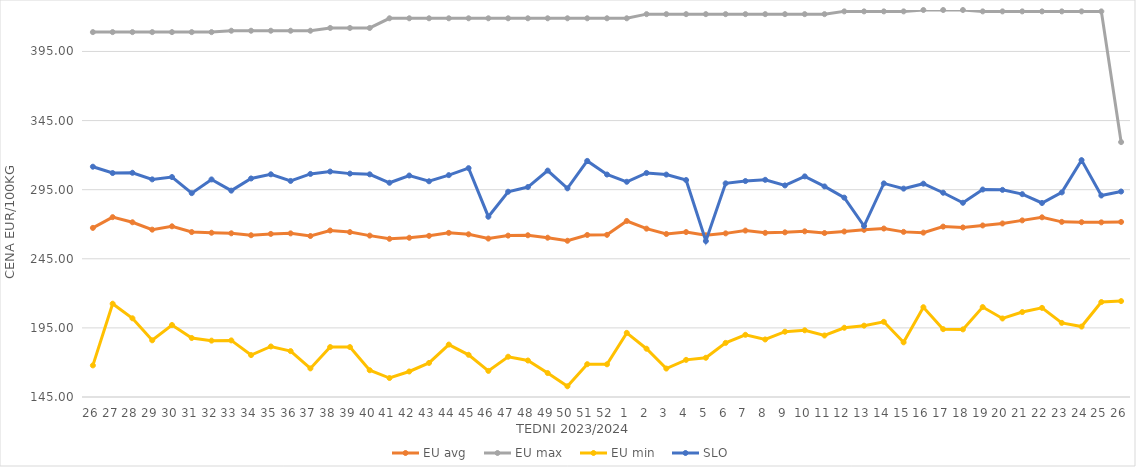
| Category | EU avg | EU max | EU min | SLO |
|---|---|---|---|---|
| 26.0 | 267.345 | 409 | 167.858 | 311.62 |
| 27.0 | 275.123 | 409 | 212.506 | 307.04 |
| 28.0 | 271.42 | 409 | 201.945 | 307.23 |
| 29.0 | 266.08 | 409 | 186.018 | 302.45 |
| 30.0 | 268.49 | 409 | 197.093 | 304.14 |
| 31.0 | 264.334 | 409 | 187.684 | 292.49 |
| 32.0 | 263.844 | 409 | 185.774 | 302.41 |
| 33.0 | 263.441 | 410 | 185.951 | 294.3 |
| 34.0 | 262.028 | 410 | 175.332 | 303.1 |
| 35.0 | 262.997 | 410 | 181.543 | 306.13 |
| 36.0 | 263.389 | 410 | 178.207 | 301.32 |
| 37.0 | 261.486 | 410 | 165.697 | 306.4 |
| 38.0 | 265.47 | 412 | 181.159 | 308.12 |
| 39.0 | 264.316 | 412 | 181.124 | 306.62 |
| 40.0 | 261.774 | 412 | 164.37 | 306.1 |
| 41.0 | 259.456 | 419 | 158.728 | 300 |
| 42.0 | 260.21 | 419 | 163.464 | 305.24 |
| 43.0 | 261.605 | 419 | 169.66 | 301.07 |
| 44.0 | 263.758 | 419 | 182.925 | 305.52 |
| 45.0 | 262.714 | 419 | 175.524 | 310.58 |
| 46.0 | 259.625 | 419 | 163.882 | 275.46 |
| 47.0 | 261.772 | 419 | 174.136 | 293.51 |
| 48.0 | 262.018 | 419 | 171.4 | 296.9 |
| 49.0 | 260.246 | 419 | 162.336 | 308.8 |
| 50.0 | 258.042 | 419 | 152.762 | 295.97 |
| 51.0 | 262.231 | 419 | 168.739 | 315.82 |
| 52.0 | 262.325 | 419 | 168.659 | 305.97 |
| 1.0 | 272.352 | 419 | 191.406 | 300.71 |
| 2.0 | 266.798 | 422 | 179.926 | 307.09 |
| 3.0 | 262.938 | 422 | 165.575 | 305.92 |
| 4.0 | 264.34 | 422 | 171.865 | 301.97 |
| 5.0 | 262.015 | 422 | 173.378 | 257.83 |
| 6.0 | 263.39 | 422 | 184.141 | 299.57 |
| 7.0 | 265.419 | 422 | 190.004 | 301.25 |
| 8.0 | 263.762 | 422 | 186.634 | 302.13 |
| 9.0 | 264.137 | 422 | 192.243 | 298.07 |
| 10.0 | 264.859 | 422 | 193.276 | 304.62 |
| 11.0 | 263.652 | 422 | 189.495 | 297.35 |
| 12.0 | 264.728 | 424 | 195.103 | 289.25 |
| 13.0 | 265.942 | 424 | 196.623 | 268.71 |
| 14.0 | 266.881 | 424 | 199.39 | 299.54 |
| 15.0 | 264.469 | 424 | 184.549 | 295.76 |
| 16.0 | 263.92 | 425 | 209.956 | 299.34 |
| 17.0 | 268.274 | 425 | 194.091 | 292.78 |
| 18.0 | 267.67 | 425 | 193.924 | 285.52 |
| 19.0 | 269.114 | 424 | 210.073 | 295.12 |
| 20.0 | 270.554 | 424 | 201.817 | 294.86 |
| 21.0 | 272.784 | 424 | 206.456 | 291.76 |
| 22.0 | 275.002 | 424 | 209.481 | 285.37 |
| 23.0 | 271.708 | 424 | 198.618 | 293.03 |
| 24.0 | 271.467 | 424 | 195.961 | 316.37 |
| 25.0 | 271.362 | 424 | 213.708 | 290.79 |
| 26.0 | 271.655 | 329.438 | 214.393 | 293.67 |